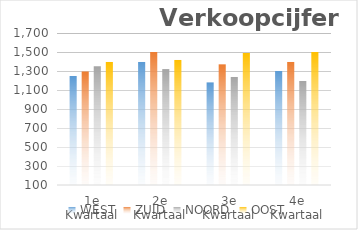
| Category | WEST | ZUID | NOORD | OOST |
|---|---|---|---|---|
| 1e Kwartaal | 1250 | 1295 | 1350 | 1400 |
| 2e Kwartaal | 1400 | 1500 | 1320 | 1420 |
| 3e Kwartaal | 1180 | 1370 | 1240 | 1490 |
| 4e Kwartaal | 1305 | 1400 | 1200 | 1500 |